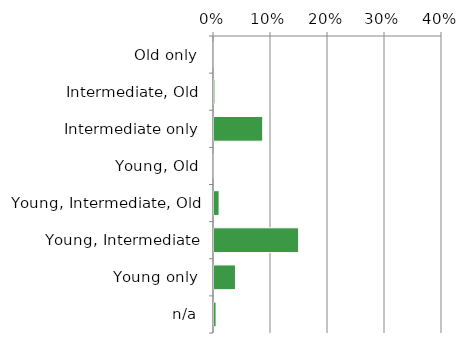
| Category | Non native |
|---|---|
| n/a | 0.005 |
| Young only | 0.039 |
| Young, Intermediate | 0.15 |
| Young, Intermediate, Old | 0.011 |
| Young, Old | 0 |
| Intermediate only | 0.087 |
| Intermediate, Old | 0.003 |
| Old only | 0 |